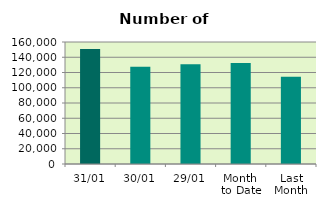
| Category | Series 0 |
|---|---|
| 31/01 | 150716 |
| 30/01 | 127426 |
| 29/01 | 130798 |
| Month 
to Date | 132423.636 |
| Last
Month | 114459.3 |